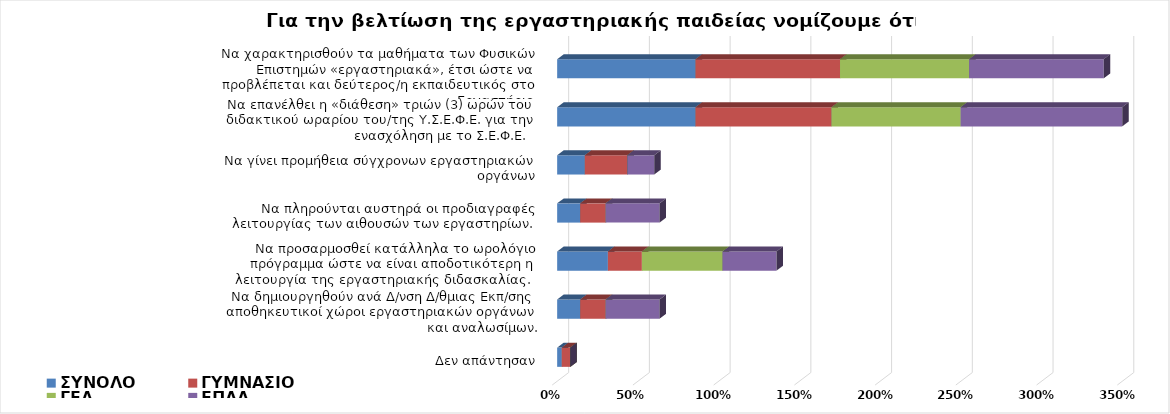
| Category | ΣΥΝΟΛΟ | ΓΥΜΝΑΣΙΟ | ΓΕΛ | ΕΠΑΛ |
|---|---|---|---|---|
| Να χαρακτηρισθούν τα μαθήματα των Φυσικών Επιστημών «εργαστηριακά», έτσι ώστε να προβλέπεται και δεύτερος/η εκπαιδευτικός στο Εργαστήριο. | 0.857 | 0.895 | 0.8 | 0.833 |
| Να επανέλθει η «διάθεση» τριών (3) ωρών του διδακτικού ωραρίου του/της Υ.Σ.Ε.Φ.Ε. για την ενασχόληση με το Σ.Ε.Φ.Ε.   | 0.857 | 0.842 | 0.8 | 1 |
| Να γίνει προμήθεια σύγχρονων εργαστηριακών οργάνων  | 0.171 | 0.263 | 0 | 0.167 |
| Nα πληρούνται αυστηρά οι προδιαγραφές λειτουργίας των αιθουσών των εργαστηρίων. | 0.143 | 0.158 | 0 | 0.333 |
| Να προσαρμοσθεί κατάλληλα το ωρολόγιο πρόγραμμα ώστε να είναι αποδοτικότερη η λειτουργία της εργαστηριακής διδασκαλίας.  | 0.314 | 0.211 | 0.5 | 0.333 |
| Να δημιουργηθούν ανά Δ/νση Δ/θμιας Εκπ/σης αποθηκευτικοί χώροι εργαστηριακών οργάνων και αναλωσίμων. | 0.143 | 0.158 | 0 | 0.333 |
| Δεν απάντησαν | 0.029 | 0.053 | 0 | 0 |